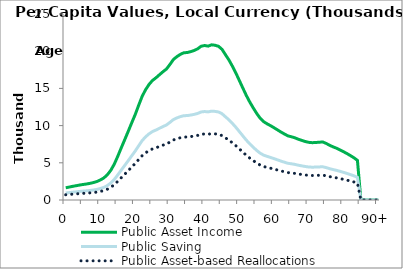
| Category | Public Asset Income | Public Saving | Public Asset-based Reallocations |
|---|---|---|---|
| 0 | 1644.016 | 941.318 | 702.698 |
|  | 1740.95 | 996.82 | 744.13 |
| 2 | 1836.306 | 1051.419 | 784.888 |
| 3 | 1922.736 | 1100.906 | 821.83 |
| 4 | 2007.911 | 1149.675 | 858.237 |
| 5 | 2086.041 | 1194.41 | 891.631 |
| 6 | 2154.045 | 1233.347 | 920.698 |
| 7 | 2238.311 | 1281.595 | 956.716 |
| 8 | 2346.789 | 1343.707 | 1003.082 |
| 9 | 2489.394 | 1425.358 | 1064.035 |
| 10 | 2699.079 | 1545.418 | 1153.661 |
| 11 | 2975.94 | 1703.942 | 1271.999 |
| 12 | 3398.199 | 1945.715 | 1452.484 |
| 13 | 4006.81 | 2294.189 | 1712.621 |
| 14 | 4837.837 | 2770.012 | 2067.825 |
| 15 | 5896.643 | 3376.256 | 2520.388 |
| 16 | 7027.544 | 4023.778 | 3003.766 |
| 17 | 8121.021 | 4649.873 | 3471.148 |
| 18 | 9238.013 | 5289.432 | 3948.581 |
| 19 | 10372.532 | 5939.026 | 4433.506 |
| 20 | 11477.577 | 6571.745 | 4905.832 |
| 21 | 12727.79 | 7287.582 | 5440.207 |
| 22 | 13927.291 | 7974.383 | 5952.907 |
| 23 | 14832.811 | 8492.859 | 6339.952 |
| 24 | 15538.099 | 8896.688 | 6641.411 |
| 25 | 16078.363 | 9206.028 | 6872.335 |
| 26 | 16429.11 | 9406.856 | 7022.254 |
| 27 | 16842.093 | 9643.319 | 7198.774 |
| 28 | 17241.186 | 9871.829 | 7369.357 |
| 29 | 17603.49 | 10079.274 | 7524.216 |
| 30 | 18212.76 | 10428.125 | 7784.635 |
| 31 | 18882.976 | 10811.872 | 8071.103 |
| 32 | 19266.004 | 11031.184 | 8234.82 |
| 33 | 19571.484 | 11206.093 | 8365.391 |
| 34 | 19790.681 | 11331.599 | 8459.082 |
| 35 | 19821.1 | 11349.017 | 8472.084 |
| 36 | 19943.506 | 11419.103 | 8524.403 |
| 37 | 20098.635 | 11507.925 | 8590.71 |
| 38 | 20322.761 | 11636.254 | 8686.507 |
| 39 | 20667.946 | 11833.897 | 8834.049 |
| 40 | 20765.741 | 11889.892 | 8875.849 |
| 41 | 20680.96 | 11841.349 | 8839.611 |
| 42 | 20858.458 | 11942.979 | 8915.479 |
| 43 | 20798.861 | 11908.855 | 8890.005 |
| 44 | 20656.804 | 11827.517 | 8829.286 |
| 45 | 20252.933 | 11596.272 | 8656.661 |
| 46 | 19527.388 | 11180.845 | 8346.543 |
| 47 | 18817.893 | 10774.608 | 8043.285 |
| 48 | 17976.538 | 10292.871 | 7683.667 |
| 49 | 17061.536 | 9768.966 | 7292.57 |
| 50 | 16055.97 | 9193.207 | 6862.763 |
| 51 | 15047.849 | 8615.984 | 6431.865 |
| 52 | 14056.704 | 8048.482 | 6008.222 |
| 53 | 13166.862 | 7538.983 | 5627.879 |
| 54 | 12375.301 | 7085.757 | 5289.544 |
| 55 | 11632.423 | 6660.405 | 4972.018 |
| 56 | 10982.751 | 6288.421 | 4694.33 |
| 57 | 10526.655 | 6027.273 | 4499.382 |
| 58 | 10237.08 | 5861.47 | 4375.61 |
| 59 | 9984.031 | 5716.582 | 4267.45 |
| 60 | 9706.04 | 5557.411 | 4148.628 |
| 61 | 9416.905 | 5391.861 | 4025.044 |
| 62 | 9128.735 | 5226.862 | 3901.872 |
| 63 | 8863.423 | 5074.952 | 3788.471 |
| 64 | 8614.29 | 4932.305 | 3681.984 |
| 65 | 8497.965 | 4865.701 | 3632.264 |
| 66 | 8355.597 | 4784.185 | 3571.412 |
| 67 | 8164.342 | 4674.678 | 3489.665 |
| 68 | 8009.017 | 4585.743 | 3423.274 |
| 69 | 7857.738 | 4499.125 | 3358.614 |
| 70 | 7749.377 | 4437.08 | 3312.297 |
| 71 | 7704.075 | 4411.141 | 3292.934 |
| 72 | 7729.474 | 4425.684 | 3303.79 |
| 73 | 7766.917 | 4447.123 | 3319.794 |
| 74 | 7800.327 | 4466.252 | 3334.074 |
| 75 | 7604.362 | 4354.049 | 3250.314 |
| 76 | 7354.661 | 4211.077 | 3143.584 |
| 77 | 7139.631 | 4087.956 | 3051.675 |
| 78 | 6957.022 | 3983.399 | 2973.623 |
| 79 | 6726.643 | 3851.491 | 2875.152 |
| 80 | 6488.917 | 3715.376 | 2773.542 |
| 81 | 6236.692 | 3570.958 | 2665.734 |
| 82 | 5965.474 | 3415.667 | 2549.808 |
| 83 | 5673.543 | 3248.515 | 2425.028 |
| 84 | 5323.367 | 3048.014 | 2275.354 |
| 85 | 0 | 0 | 0 |
| 86 | 0 | 0 | 0 |
| 87 | 0 | 0 | 0 |
| 88 | 0 | 0 | 0 |
| 89 | 0 | 0 | 0 |
| 90+ | 0 | 0 | 0 |